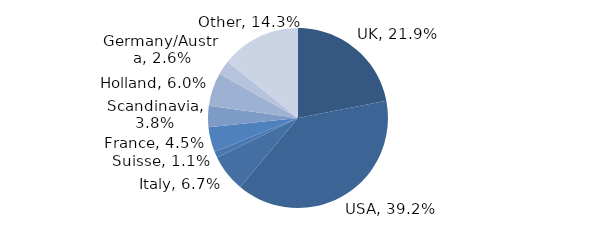
| Category | Investment Style |
|---|---|
| UK | 0.219 |
| USA | 0.392 |
| Italy | 0.067 |
| Suisse | 0.011 |
| France | 0.045 |
| Scandinavia | 0.038 |
| Holland | 0.06 |
| Germany/Austria | 0.026 |
| Other | 0.143 |